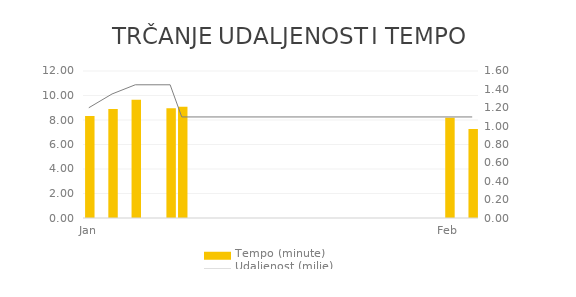
| Category | Tempo (minute) |
|---|---|
| 2012-01-01 | 8.333 |
| 2012-01-03 | 8.889 |
| 2012-01-05 | 9.655 |
| 2012-01-08 | 8.966 |
| 2012-01-09 | 9.091 |
| 2012-02-01 | 8.182 |
| 2012-02-03 | 7.273 |